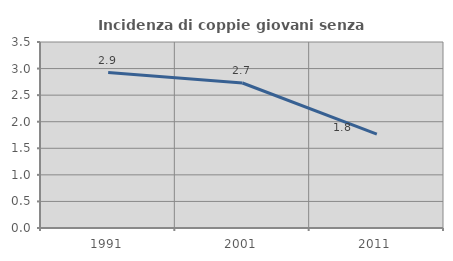
| Category | Incidenza di coppie giovani senza figli |
|---|---|
| 1991.0 | 2.925 |
| 2001.0 | 2.728 |
| 2011.0 | 1.765 |